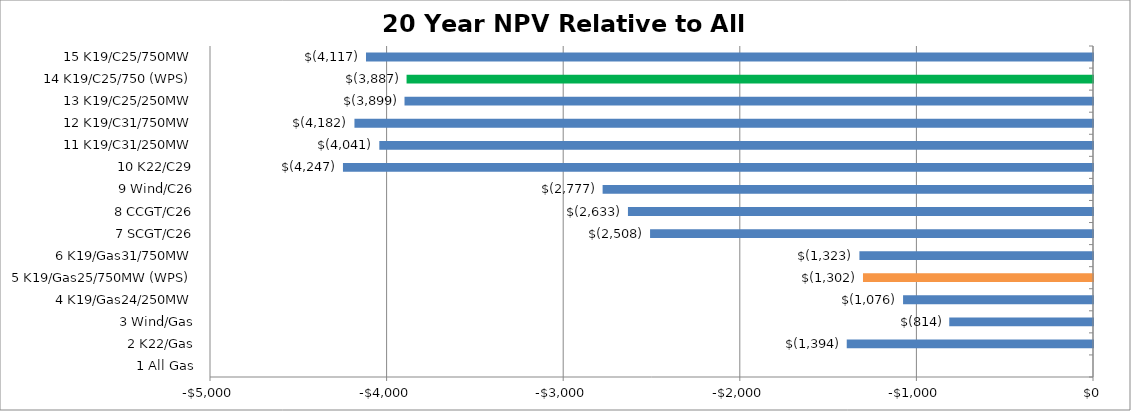
| Category | 20 NPV |
|---|---|
| 1 All Gas | 0 |
| 2 K22/Gas | -1394.422 |
| 3 Wind/Gas | -813.985 |
| 4 K19/Gas24/250MW | -1075.502 |
| 5 K19/Gas25/750MW (WPS) | -1302.433 |
| 6 K19/Gas31/750MW | -1322.71 |
| 7 SCGT/C26 | -2508.13 |
| 8 CCGT/C26 | -2633.374 |
| 9 Wind/C26 | -2776.831 |
| 10 K22/C29 | -4247.133 |
| 11 K19/C31/250MW | -4041.279 |
| 12 K19/C31/750MW | -4182.041 |
| 13 K19/C25/250MW | -3898.537 |
| 14 K19/C25/750 (WPS) | -3886.929 |
| 15 K19/C25/750MW | -4116.685 |